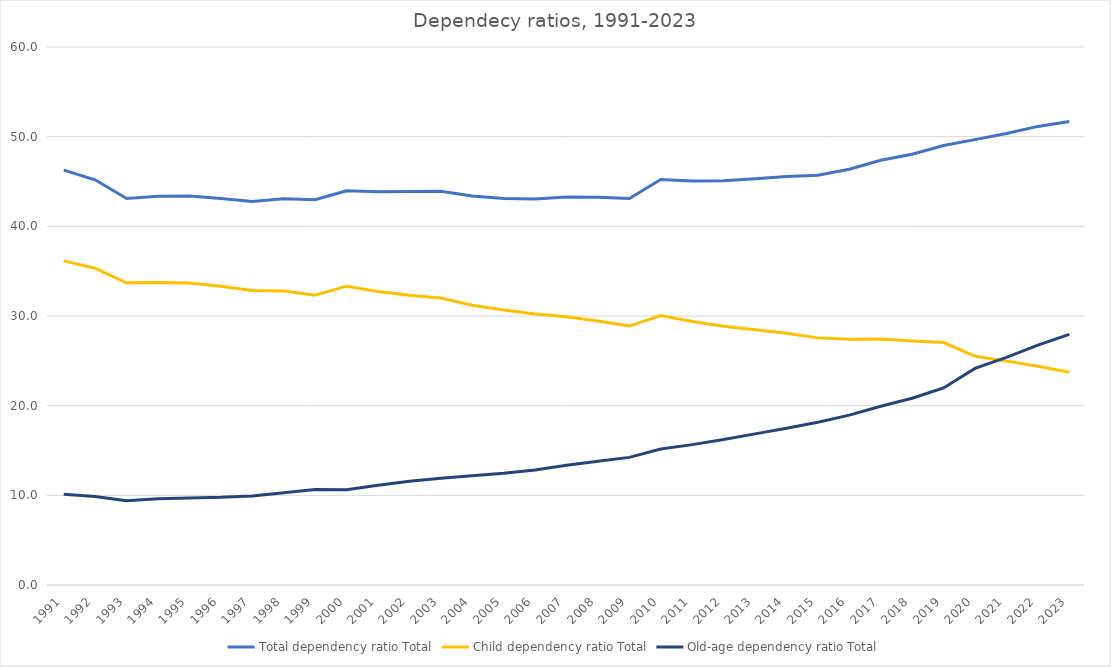
| Category | Total dependency ratio | Child dependency ratio | Old-age dependency ratio |
|---|---|---|---|
| 1991.0 | 46.269 | 36.15 | 10.118 |
| 1992.0 | 45.192 | 35.32 | 9.872 |
| 1993.0 | 43.096 | 33.701 | 9.395 |
| 1994.0 | 43.35 | 33.729 | 9.621 |
| 1995.0 | 43.387 | 33.68 | 9.708 |
| 1996.0 | 43.1 | 33.324 | 9.776 |
| 1997.0 | 42.779 | 32.85 | 9.929 |
| 1998.0 | 43.068 | 32.788 | 10.28 |
| 1999.0 | 42.973 | 32.319 | 10.655 |
| 2000.0 | 43.962 | 33.326 | 10.636 |
| 2001.0 | 43.855 | 32.737 | 11.117 |
| 2002.0 | 43.881 | 32.317 | 11.563 |
| 2003.0 | 43.922 | 32.004 | 11.917 |
| 2004.0 | 43.381 | 31.203 | 12.178 |
| 2005.0 | 43.113 | 30.659 | 12.454 |
| 2006.0 | 43.047 | 30.217 | 12.829 |
| 2007.0 | 43.269 | 29.92 | 13.349 |
| 2008.0 | 43.246 | 29.433 | 13.813 |
| 2009.0 | 43.107 | 28.876 | 14.231 |
| 2010.0 | 45.218 | 30.05 | 15.168 |
| 2011.0 | 45.043 | 29.39 | 15.653 |
| 2012.0 | 45.091 | 28.864 | 16.227 |
| 2013.0 | 45.308 | 28.454 | 16.854 |
| 2014.0 | 45.55 | 28.077 | 17.473 |
| 2015.0 | 45.707 | 27.56 | 18.146 |
| 2016.0 | 46.36 | 27.413 | 18.947 |
| 2017.0 | 47.364 | 27.427 | 19.937 |
| 2018.0 | 48.041 | 27.207 | 20.834 |
| 2019.0 | 49.014 | 27.039 | 21.975 |
| 2020.0 | 49.672 | 25.519 | 24.153 |
| 2021.0 | 50.351 | 24.969 | 25.383 |
| 2022.0 | 51.145 | 24.394 | 26.751 |
| 2023.0 | 51.684 | 23.729 | 27.955 |